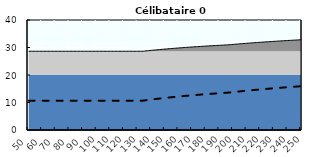
| Category | Coin fiscal moyen (somme des composantes) | Taux moyen d'imposition net en % du salaire brut |
|---|---|---|
| 50.0 | 28.633 | 10.67 |
| 51.0 | 28.633 | 10.67 |
| 52.0 | 28.633 | 10.67 |
| 53.0 | 28.633 | 10.67 |
| 54.0 | 28.633 | 10.67 |
| 55.0 | 28.633 | 10.67 |
| 56.0 | 28.633 | 10.67 |
| 57.0 | 28.633 | 10.67 |
| 58.0 | 28.633 | 10.67 |
| 59.0 | 28.633 | 10.67 |
| 60.0 | 28.633 | 10.67 |
| 61.0 | 28.633 | 10.67 |
| 62.0 | 28.633 | 10.67 |
| 63.0 | 28.633 | 10.67 |
| 64.0 | 28.633 | 10.67 |
| 65.0 | 28.633 | 10.67 |
| 66.0 | 28.633 | 10.67 |
| 67.0 | 28.633 | 10.67 |
| 68.0 | 28.633 | 10.67 |
| 69.0 | 28.633 | 10.67 |
| 70.0 | 28.633 | 10.67 |
| 71.0 | 28.633 | 10.67 |
| 72.0 | 28.633 | 10.67 |
| 73.0 | 28.633 | 10.67 |
| 74.0 | 28.633 | 10.67 |
| 75.0 | 28.633 | 10.67 |
| 76.0 | 28.633 | 10.67 |
| 77.0 | 28.633 | 10.67 |
| 78.0 | 28.633 | 10.67 |
| 79.0 | 28.633 | 10.67 |
| 80.0 | 28.633 | 10.67 |
| 81.0 | 28.633 | 10.67 |
| 82.0 | 28.633 | 10.67 |
| 83.0 | 28.633 | 10.67 |
| 84.0 | 28.633 | 10.67 |
| 85.0 | 28.633 | 10.67 |
| 86.0 | 28.633 | 10.67 |
| 87.0 | 28.633 | 10.67 |
| 88.0 | 28.633 | 10.67 |
| 89.0 | 28.633 | 10.67 |
| 90.0 | 28.633 | 10.67 |
| 91.0 | 28.633 | 10.67 |
| 92.0 | 28.633 | 10.67 |
| 93.0 | 28.633 | 10.67 |
| 94.0 | 28.633 | 10.67 |
| 95.0 | 28.633 | 10.67 |
| 96.0 | 28.633 | 10.67 |
| 97.0 | 28.633 | 10.67 |
| 98.0 | 28.633 | 10.67 |
| 99.0 | 28.633 | 10.67 |
| 100.0 | 28.633 | 10.67 |
| 101.0 | 28.633 | 10.67 |
| 102.0 | 28.633 | 10.67 |
| 103.0 | 28.633 | 10.67 |
| 104.0 | 28.633 | 10.67 |
| 105.0 | 28.633 | 10.67 |
| 106.0 | 28.633 | 10.67 |
| 107.0 | 28.633 | 10.67 |
| 108.0 | 28.633 | 10.67 |
| 109.0 | 28.633 | 10.67 |
| 110.0 | 28.633 | 10.67 |
| 111.0 | 28.633 | 10.67 |
| 112.0 | 28.633 | 10.67 |
| 113.0 | 28.633 | 10.67 |
| 114.0 | 28.633 | 10.67 |
| 115.0 | 28.633 | 10.67 |
| 116.0 | 28.633 | 10.67 |
| 117.0 | 28.633 | 10.67 |
| 118.0 | 28.633 | 10.67 |
| 119.0 | 28.633 | 10.67 |
| 120.0 | 28.633 | 10.67 |
| 121.0 | 28.633 | 10.67 |
| 122.0 | 28.633 | 10.67 |
| 123.0 | 28.633 | 10.67 |
| 124.0 | 28.633 | 10.67 |
| 125.0 | 28.633 | 10.67 |
| 126.0 | 28.633 | 10.67 |
| 127.0 | 28.633 | 10.67 |
| 128.0 | 28.633 | 10.67 |
| 129.0 | 28.633 | 10.67 |
| 130.0 | 28.633 | 10.67 |
| 131.0 | 28.633 | 10.67 |
| 132.0 | 28.633 | 10.67 |
| 133.0 | 28.633 | 10.67 |
| 134.0 | 28.643 | 10.682 |
| 135.0 | 28.697 | 10.75 |
| 136.0 | 28.75 | 10.817 |
| 137.0 | 28.803 | 10.883 |
| 138.0 | 28.855 | 10.948 |
| 139.0 | 28.906 | 11.012 |
| 140.0 | 28.957 | 11.075 |
| 141.0 | 29.006 | 11.137 |
| 142.0 | 29.055 | 11.198 |
| 143.0 | 29.104 | 11.259 |
| 144.0 | 29.151 | 11.319 |
| 145.0 | 29.198 | 11.377 |
| 146.0 | 29.245 | 11.435 |
| 147.0 | 29.29 | 11.493 |
| 148.0 | 29.335 | 11.549 |
| 149.0 | 29.38 | 11.605 |
| 150.0 | 29.424 | 11.66 |
| 151.0 | 29.467 | 11.714 |
| 152.0 | 29.51 | 11.767 |
| 153.0 | 29.552 | 11.82 |
| 154.0 | 29.594 | 11.872 |
| 155.0 | 29.635 | 11.924 |
| 156.0 | 29.675 | 11.975 |
| 157.0 | 29.715 | 12.025 |
| 158.0 | 29.755 | 12.074 |
| 159.0 | 29.794 | 12.123 |
| 160.0 | 29.833 | 12.172 |
| 161.0 | 29.871 | 12.219 |
| 162.0 | 29.908 | 12.266 |
| 163.0 | 29.946 | 12.313 |
| 164.0 | 29.982 | 12.359 |
| 165.0 | 30.018 | 12.404 |
| 166.0 | 30.054 | 12.449 |
| 167.0 | 30.09 | 12.493 |
| 168.0 | 30.125 | 12.537 |
| 169.0 | 30.159 | 12.58 |
| 170.0 | 30.193 | 12.623 |
| 171.0 | 30.227 | 12.665 |
| 172.0 | 30.261 | 12.707 |
| 173.0 | 30.294 | 12.748 |
| 174.0 | 30.326 | 12.789 |
| 175.0 | 30.358 | 12.83 |
| 176.0 | 30.39 | 12.869 |
| 177.0 | 30.422 | 12.909 |
| 178.0 | 30.453 | 12.948 |
| 179.0 | 30.484 | 12.986 |
| 180.0 | 30.514 | 13.024 |
| 181.0 | 30.544 | 13.062 |
| 182.0 | 30.574 | 13.099 |
| 183.0 | 30.603 | 13.136 |
| 184.0 | 30.633 | 13.173 |
| 185.0 | 30.661 | 13.209 |
| 186.0 | 30.69 | 13.245 |
| 187.0 | 30.718 | 13.28 |
| 188.0 | 30.746 | 13.315 |
| 189.0 | 30.774 | 13.349 |
| 190.0 | 30.801 | 13.384 |
| 191.0 | 30.828 | 13.417 |
| 192.0 | 30.855 | 13.451 |
| 193.0 | 30.881 | 13.484 |
| 194.0 | 30.907 | 13.517 |
| 195.0 | 30.933 | 13.549 |
| 196.0 | 30.959 | 13.582 |
| 197.0 | 30.996 | 13.627 |
| 198.0 | 31.039 | 13.682 |
| 199.0 | 31.083 | 13.736 |
| 200.0 | 31.125 | 13.789 |
| 201.0 | 31.168 | 13.842 |
| 202.0 | 31.209 | 13.895 |
| 203.0 | 31.251 | 13.947 |
| 204.0 | 31.292 | 13.998 |
| 205.0 | 31.333 | 14.049 |
| 206.0 | 31.373 | 14.1 |
| 207.0 | 31.413 | 14.15 |
| 208.0 | 31.452 | 14.199 |
| 209.0 | 31.492 | 14.248 |
| 210.0 | 31.53 | 14.297 |
| 211.0 | 31.569 | 14.345 |
| 212.0 | 31.607 | 14.392 |
| 213.0 | 31.644 | 14.439 |
| 214.0 | 31.682 | 14.486 |
| 215.0 | 31.719 | 14.532 |
| 216.0 | 31.755 | 14.578 |
| 217.0 | 31.792 | 14.624 |
| 218.0 | 31.828 | 14.669 |
| 219.0 | 31.863 | 14.713 |
| 220.0 | 31.899 | 14.757 |
| 221.0 | 31.934 | 14.801 |
| 222.0 | 31.968 | 14.845 |
| 223.0 | 32.003 | 14.888 |
| 224.0 | 32.037 | 14.93 |
| 225.0 | 32.07 | 14.973 |
| 226.0 | 32.104 | 15.014 |
| 227.0 | 32.137 | 15.056 |
| 228.0 | 32.17 | 15.097 |
| 229.0 | 32.202 | 15.138 |
| 230.0 | 32.235 | 15.178 |
| 231.0 | 32.267 | 15.218 |
| 232.0 | 32.299 | 15.258 |
| 233.0 | 32.33 | 15.298 |
| 234.0 | 32.361 | 15.337 |
| 235.0 | 32.392 | 15.375 |
| 236.0 | 32.423 | 15.414 |
| 237.0 | 32.453 | 15.452 |
| 238.0 | 32.483 | 15.49 |
| 239.0 | 32.513 | 15.527 |
| 240.0 | 32.543 | 15.564 |
| 241.0 | 32.572 | 15.601 |
| 242.0 | 32.602 | 15.637 |
| 243.0 | 32.631 | 15.674 |
| 244.0 | 32.659 | 15.71 |
| 245.0 | 32.688 | 15.745 |
| 246.0 | 32.716 | 15.78 |
| 247.0 | 32.744 | 15.816 |
| 248.0 | 32.772 | 15.85 |
| 249.0 | 32.799 | 15.885 |
| 250.0 | 32.827 | 15.919 |